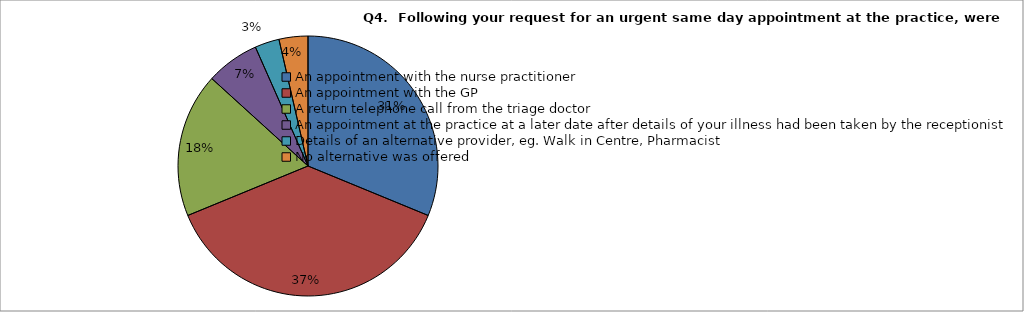
| Category | Series 0 |
|---|---|
| An appointment with the nurse practitioner | 0.312 |
| An appointment with the GP | 0.376 |
| A return telephone call from the triage doctor | 0.18 |
| An appointment at the practice at a later date after details of your illness had been taken by the receptionist | 0.066 |
| Details of an alternative provider, eg. Walk in Centre, Pharmacist | 0.03 |
| No alternative was offered | 0.036 |